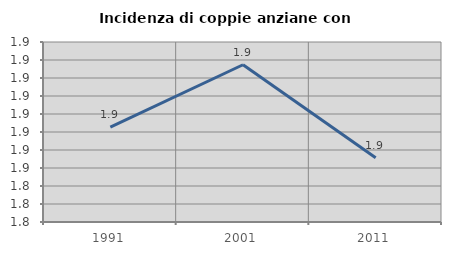
| Category | Incidenza di coppie anziane con figli |
|---|---|
| 1991.0 | 1.873 |
| 2001.0 | 1.907 |
| 2011.0 | 1.856 |